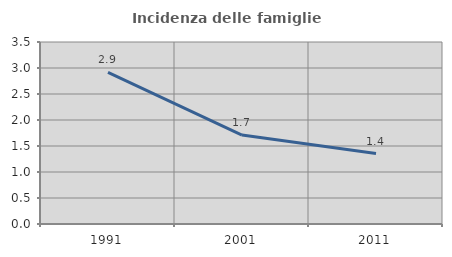
| Category | Incidenza delle famiglie numerose |
|---|---|
| 1991.0 | 2.917 |
| 2001.0 | 1.711 |
| 2011.0 | 1.355 |